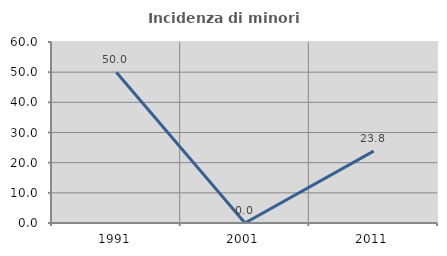
| Category | Incidenza di minori stranieri |
|---|---|
| 1991.0 | 50 |
| 2001.0 | 0 |
| 2011.0 | 23.81 |